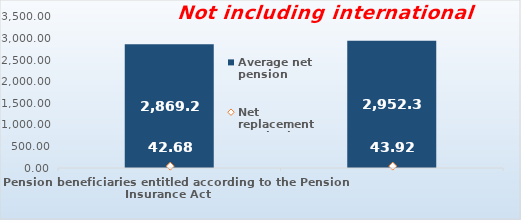
| Category | Average net pension  |
|---|---|
| Pension beneficiaries entitled according to the Pension Insurance Act   | 2869.2 |
| Pension beneficiaries entitled to pension FOR THE FIRST TIME in 2020 according to the Pension Insurance Act  - NEW BENEFICIARIES | 2952.325 |